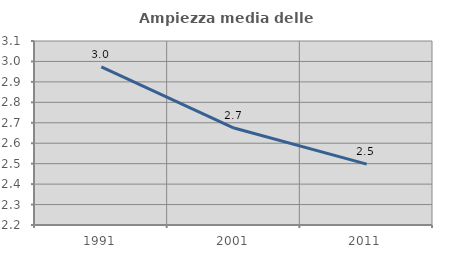
| Category | Ampiezza media delle famiglie |
|---|---|
| 1991.0 | 2.974 |
| 2001.0 | 2.674 |
| 2011.0 | 2.498 |